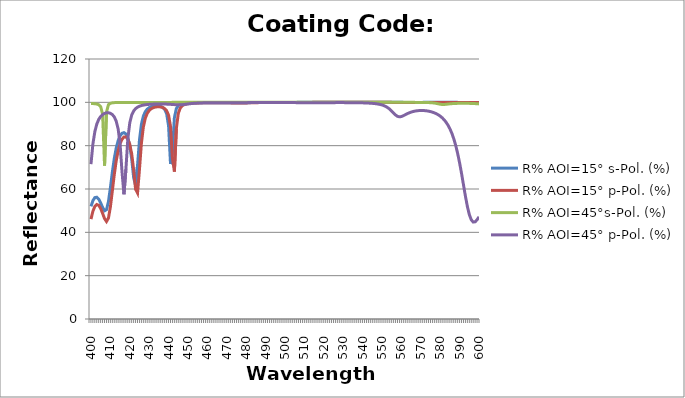
| Category | R% AOI=15° s-Pol. (%) | R% AOI=15° p-Pol. (%) | R% AOI=45°s-Pol. (%) | R% AOI=45° p-Pol. (%) |
|---|---|---|---|---|
| 400.0 | 51.973 | 46.092 | 99.432 | 71.471 |
| 401.0 | 54.655 | 49.743 | 99.421 | 80.803 |
| 402.0 | 56.032 | 51.964 | 99.359 | 86.494 |
| 403.0 | 56.211 | 52.843 | 99.213 | 89.957 |
| 404.0 | 55.32 | 52.478 | 98.885 | 92.113 |
| 405.0 | 53.585 | 51.014 | 98.02 | 93.481 |
| 406.0 | 51.492 | 48.756 | 94.522 | 94.347 |
| 407.0 | 49.95 | 46.339 | 70.794 | 94.881 |
| 408.0 | 50.446 | 45.007 | 95.485 | 95.166 |
| 409.0 | 54.16 | 46.553 | 98.912 | 95.19 |
| 410.0 | 60.533 | 51.642 | 99.557 | 94.944 |
| 411.0 | 67.687 | 59.014 | 99.768 | 94.363 |
| 412.0 | 74.009 | 66.571 | 99.859 | 93.282 |
| 413.0 | 78.864 | 72.918 | 99.905 | 91.342 |
| 414.0 | 82.278 | 77.66 | 99.931 | 87.752 |
| 415.0 | 84.484 | 80.927 | 99.946 | 80.764 |
| 416.0 | 85.697 | 82.973 | 99.956 | 67.974 |
| 417.0 | 86.018 | 83.991 | 99.963 | 57.562 |
| 418.0 | 85.404 | 84.047 | 99.967 | 69.024 |
| 419.0 | 83.595 | 83.042 | 99.969 | 83.175 |
| 420.0 | 80.02 | 80.64 | 99.971 | 90.538 |
| 421.0 | 73.797 | 76.174 | 99.971 | 94.129 |
| 422.0 | 65.228 | 68.835 | 99.97 | 96.022 |
| 423.0 | 61.6 | 59.894 | 99.969 | 97.108 |
| 424.0 | 70.94 | 58.148 | 99.966 | 97.778 |
| 425.0 | 82.68 | 69.075 | 99.962 | 98.215 |
| 426.0 | 89.856 | 81.152 | 99.958 | 98.512 |
| 427.0 | 93.65 | 88.595 | 99.953 | 98.721 |
| 428.0 | 95.696 | 92.658 | 99.948 | 98.873 |
| 429.0 | 96.859 | 94.913 | 99.943 | 98.984 |
| 430.0 | 97.55 | 96.223 | 99.941 | 99.067 |
| 431.0 | 97.968 | 97.013 | 99.94 | 99.128 |
| 432.0 | 98.215 | 97.496 | 99.941 | 99.173 |
| 433.0 | 98.339 | 97.782 | 99.943 | 99.204 |
| 434.0 | 98.362 | 97.925 | 99.946 | 99.224 |
| 435.0 | 98.283 | 97.951 | 99.948 | 99.234 |
| 436.0 | 98.068 | 97.856 | 99.95 | 99.234 |
| 437.0 | 97.631 | 97.604 | 99.953 | 99.224 |
| 438.0 | 96.747 | 97.103 | 99.957 | 99.204 |
| 439.0 | 94.744 | 96.128 | 99.962 | 99.172 |
| 440.0 | 89.088 | 94.058 | 99.969 | 99.129 |
| 441.0 | 71.52 | 88.855 | 99.976 | 99.074 |
| 442.0 | 77.575 | 74.15 | 99.982 | 99.01 |
| 443.0 | 92.953 | 68.047 | 99.986 | 98.943 |
| 444.0 | 97.096 | 87.822 | 99.99 | 98.885 |
| 445.0 | 98.446 | 94.873 | 99.992 | 98.852 |
| 446.0 | 99.036 | 97.314 | 99.994 | 98.857 |
| 447.0 | 99.345 | 98.376 | 99.995 | 98.908 |
| 448.0 | 99.522 | 98.916 | 99.996 | 99 |
| 449.0 | 99.633 | 99.22 | 99.997 | 99.117 |
| 450.0 | 99.705 | 99.406 | 99.997 | 99.24 |
| 451.0 | 99.754 | 99.527 | 99.998 | 99.356 |
| 452.0 | 99.788 | 99.608 | 99.998 | 99.456 |
| 453.0 | 99.812 | 99.664 | 99.998 | 99.539 |
| 454.0 | 99.828 | 99.704 | 99.998 | 99.606 |
| 455.0 | 99.84 | 99.732 | 99.998 | 99.66 |
| 456.0 | 99.848 | 99.752 | 99.998 | 99.701 |
| 457.0 | 99.853 | 99.766 | 99.998 | 99.734 |
| 458.0 | 99.855 | 99.775 | 99.998 | 99.76 |
| 459.0 | 99.855 | 99.781 | 99.998 | 99.779 |
| 460.0 | 99.854 | 99.783 | 99.998 | 99.794 |
| 461.0 | 99.851 | 99.783 | 99.998 | 99.805 |
| 462.0 | 99.846 | 99.781 | 99.998 | 99.813 |
| 463.0 | 99.842 | 99.778 | 99.998 | 99.818 |
| 464.0 | 99.836 | 99.774 | 99.998 | 99.82 |
| 465.0 | 99.832 | 99.769 | 99.998 | 99.82 |
| 466.0 | 99.827 | 99.765 | 99.998 | 99.819 |
| 467.0 | 99.824 | 99.761 | 99.999 | 99.815 |
| 468.0 | 99.821 | 99.758 | 99.999 | 99.81 |
| 469.0 | 99.82 | 99.755 | 99.999 | 99.804 |
| 470.0 | 99.819 | 99.753 | 99.999 | 99.797 |
| 471.0 | 99.818 | 99.751 | 100 | 99.79 |
| 472.0 | 99.818 | 99.749 | 100 | 99.785 |
| 473.0 | 99.818 | 99.747 | 100 | 99.783 |
| 474.0 | 99.817 | 99.744 | 100 | 99.784 |
| 475.0 | 99.816 | 99.742 | 100 | 99.789 |
| 476.0 | 99.815 | 99.738 | 100 | 99.798 |
| 477.0 | 99.815 | 99.736 | 100 | 99.81 |
| 478.0 | 99.818 | 99.735 | 100 | 99.824 |
| 479.0 | 99.822 | 99.736 | 100 | 99.839 |
| 480.0 | 99.831 | 99.742 | 100 | 99.854 |
| 481.0 | 99.843 | 99.753 | 100 | 99.867 |
| 482.0 | 99.858 | 99.77 | 100 | 99.88 |
| 483.0 | 99.875 | 99.79 | 100 | 99.89 |
| 484.0 | 99.892 | 99.813 | 100 | 99.899 |
| 485.0 | 99.907 | 99.836 | 100 | 99.907 |
| 486.0 | 99.921 | 99.858 | 100 | 99.913 |
| 487.0 | 99.932 | 99.878 | 100 | 99.918 |
| 488.0 | 99.942 | 99.894 | 100 | 99.922 |
| 489.0 | 99.95 | 99.909 | 100 | 99.926 |
| 490.0 | 99.956 | 99.92 | 100 | 99.928 |
| 491.0 | 99.961 | 99.93 | 100 | 99.93 |
| 492.0 | 99.965 | 99.938 | 100 | 99.932 |
| 493.0 | 99.969 | 99.944 | 100 | 99.932 |
| 494.0 | 99.971 | 99.949 | 100 | 99.932 |
| 495.0 | 99.973 | 99.953 | 100 | 99.931 |
| 496.0 | 99.975 | 99.956 | 100 | 99.93 |
| 497.0 | 99.976 | 99.959 | 100 | 99.927 |
| 498.0 | 99.977 | 99.961 | 100 | 99.924 |
| 499.0 | 99.978 | 99.962 | 100 | 99.921 |
| 500.0 | 99.979 | 99.963 | 100 | 99.916 |
| 501.0 | 99.979 | 99.964 | 100 | 99.91 |
| 502.0 | 99.979 | 99.964 | 100 | 99.903 |
| 503.0 | 99.979 | 99.965 | 100 | 99.894 |
| 504.0 | 99.979 | 99.965 | 100 | 99.884 |
| 505.0 | 99.98 | 99.965 | 100 | 99.872 |
| 506.0 | 99.98 | 99.965 | 100 | 99.859 |
| 507.0 | 99.981 | 99.966 | 100 | 99.844 |
| 508.0 | 99.982 | 99.967 | 100 | 99.828 |
| 509.0 | 99.983 | 99.968 | 100 | 99.812 |
| 510.0 | 99.985 | 99.97 | 100 | 99.796 |
| 511.0 | 99.986 | 99.973 | 100 | 99.783 |
| 512.0 | 99.988 | 99.975 | 100 | 99.774 |
| 513.0 | 99.99 | 99.978 | 100 | 99.769 |
| 514.0 | 99.991 | 99.98 | 100 | 99.769 |
| 515.0 | 99.992 | 99.983 | 100 | 99.774 |
| 516.0 | 99.993 | 99.985 | 100 | 99.782 |
| 517.0 | 99.994 | 99.987 | 100 | 99.792 |
| 518.0 | 99.995 | 99.988 | 100 | 99.804 |
| 519.0 | 99.995 | 99.99 | 100 | 99.815 |
| 520.0 | 99.996 | 99.991 | 100 | 99.826 |
| 521.0 | 99.996 | 99.992 | 100 | 99.835 |
| 522.0 | 99.997 | 99.992 | 100 | 99.844 |
| 523.0 | 99.997 | 99.993 | 100 | 99.851 |
| 524.0 | 99.997 | 99.994 | 99.999 | 99.856 |
| 525.0 | 99.997 | 99.994 | 99.999 | 99.861 |
| 526.0 | 99.998 | 99.995 | 99.999 | 99.864 |
| 527.0 | 99.998 | 99.995 | 99.999 | 99.866 |
| 528.0 | 99.998 | 99.995 | 99.998 | 99.867 |
| 529.0 | 99.998 | 99.995 | 99.998 | 99.867 |
| 530.0 | 99.998 | 99.996 | 99.998 | 99.865 |
| 531.0 | 99.998 | 99.996 | 99.997 | 99.863 |
| 532.0 | 99.998 | 99.996 | 99.997 | 99.859 |
| 533.0 | 99.998 | 99.996 | 99.996 | 99.854 |
| 534.0 | 99.998 | 99.996 | 99.996 | 99.847 |
| 535.0 | 99.998 | 99.996 | 99.996 | 99.838 |
| 536.0 | 99.998 | 99.996 | 99.996 | 99.828 |
| 537.0 | 99.998 | 99.996 | 99.997 | 99.815 |
| 538.0 | 99.998 | 99.996 | 99.997 | 99.8 |
| 539.0 | 99.998 | 99.996 | 99.997 | 99.781 |
| 540.0 | 99.998 | 99.995 | 99.997 | 99.758 |
| 541.0 | 99.998 | 99.995 | 99.997 | 99.729 |
| 542.0 | 99.998 | 99.995 | 99.997 | 99.695 |
| 543.0 | 99.998 | 99.995 | 99.998 | 99.652 |
| 544.0 | 99.998 | 99.994 | 99.998 | 99.6 |
| 545.0 | 99.997 | 99.994 | 99.998 | 99.533 |
| 546.0 | 99.997 | 99.993 | 99.998 | 99.45 |
| 547.0 | 99.997 | 99.992 | 99.998 | 99.342 |
| 548.0 | 99.997 | 99.992 | 99.998 | 99.204 |
| 549.0 | 99.996 | 99.991 | 99.997 | 99.024 |
| 550.0 | 99.996 | 99.99 | 99.997 | 98.787 |
| 551.0 | 99.995 | 99.988 | 99.997 | 98.473 |
| 552.0 | 99.995 | 99.986 | 99.997 | 98.057 |
| 553.0 | 99.994 | 99.985 | 99.997 | 97.509 |
| 554.0 | 99.993 | 99.982 | 99.996 | 96.807 |
| 555.0 | 99.992 | 99.98 | 99.996 | 95.956 |
| 556.0 | 99.991 | 99.977 | 99.996 | 95.019 |
| 557.0 | 99.989 | 99.973 | 99.995 | 94.144 |
| 558.0 | 99.987 | 99.97 | 99.995 | 93.527 |
| 559.0 | 99.985 | 99.966 | 99.994 | 93.3 |
| 560.0 | 99.983 | 99.964 | 99.993 | 93.444 |
| 561.0 | 99.981 | 99.961 | 99.992 | 93.825 |
| 562.0 | 99.979 | 99.96 | 99.991 | 94.286 |
| 563.0 | 99.977 | 99.96 | 99.99 | 94.743 |
| 564.0 | 99.976 | 99.961 | 99.988 | 95.15 |
| 565.0 | 99.975 | 99.962 | 99.986 | 95.488 |
| 566.0 | 99.975 | 99.964 | 99.983 | 95.756 |
| 567.0 | 99.976 | 99.966 | 99.98 | 95.959 |
| 568.0 | 99.977 | 99.967 | 99.975 | 96.102 |
| 569.0 | 99.978 | 99.969 | 99.969 | 96.191 |
| 570.0 | 99.979 | 99.971 | 99.96 | 96.23 |
| 571.0 | 99.98 | 99.972 | 99.949 | 96.223 |
| 572.0 | 99.981 | 99.973 | 99.934 | 96.17 |
| 573.0 | 99.982 | 99.974 | 99.912 | 96.071 |
| 574.0 | 99.983 | 99.975 | 99.88 | 95.923 |
| 575.0 | 99.984 | 99.976 | 99.834 | 95.722 |
| 576.0 | 99.984 | 99.976 | 99.764 | 95.463 |
| 577.0 | 99.984 | 99.976 | 99.661 | 95.136 |
| 578.0 | 99.985 | 99.976 | 99.512 | 94.731 |
| 579.0 | 99.985 | 99.976 | 99.32 | 94.233 |
| 580.0 | 99.985 | 99.976 | 99.124 | 93.623 |
| 581.0 | 99.985 | 99.975 | 99.004 | 92.876 |
| 582.0 | 99.985 | 99.975 | 99.006 | 91.961 |
| 583.0 | 99.984 | 99.974 | 99.094 | 90.84 |
| 584.0 | 99.984 | 99.973 | 99.207 | 89.462 |
| 585.0 | 99.983 | 99.971 | 99.31 | 87.769 |
| 586.0 | 99.983 | 99.97 | 99.391 | 85.69 |
| 587.0 | 99.982 | 99.968 | 99.452 | 83.143 |
| 588.0 | 99.981 | 99.966 | 99.496 | 80.049 |
| 589.0 | 99.98 | 99.963 | 99.526 | 76.342 |
| 590.0 | 99.978 | 99.96 | 99.545 | 72.002 |
| 591.0 | 99.977 | 99.956 | 99.555 | 67.102 |
| 592.0 | 99.975 | 99.952 | 99.557 | 61.849 |
| 593.0 | 99.972 | 99.946 | 99.552 | 56.616 |
| 594.0 | 99.97 | 99.94 | 99.54 | 51.897 |
| 595.0 | 99.966 | 99.932 | 99.52 | 48.178 |
| 596.0 | 99.962 | 99.923 | 99.493 | 45.78 |
| 597.0 | 99.958 | 99.912 | 99.457 | 44.748 |
| 598.0 | 99.952 | 99.898 | 99.411 | 44.872 |
| 599.0 | 99.945 | 99.881 | 99.354 | 45.806 |
| 600.0 | 99.937 | 99.86 | 99.282 | 47.184 |